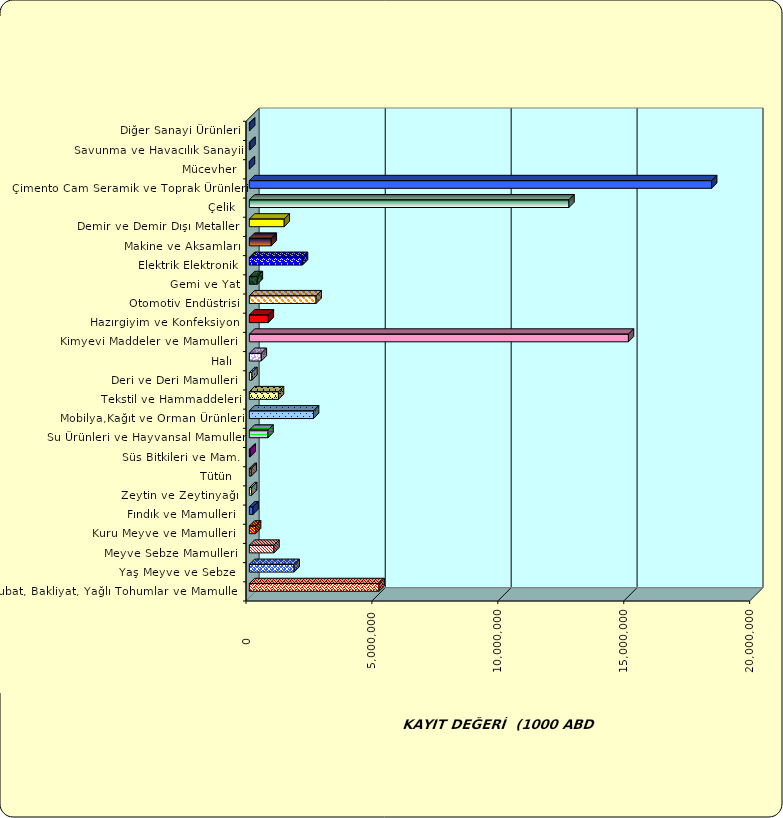
| Category | Series 0 |
|---|---|
|  Hububat, Bakliyat, Yağlı Tohumlar ve Mamulleri  | 5150457.895 |
|  Yaş Meyve ve Sebze   | 1777672.764 |
|  Meyve Sebze Mamulleri  | 976620.416 |
|  Kuru Meyve ve Mamulleri   | 245520.863 |
|  Fındık ve Mamulleri  | 144812.634 |
|  Zeytin ve Zeytinyağı  | 88911.634 |
|  Tütün  | 74180.251 |
|  Süs Bitkileri ve Mam. | 32521.128 |
|  Su Ürünleri ve Hayvansal Mamuller | 739978.662 |
|  Mobilya,Kağıt ve Orman Ürünleri | 2547974.728 |
|  Tekstil ve Hammaddeleri | 1156050.407 |
|  Deri ve Deri Mamulleri  | 100705.902 |
|  Halı  | 474819.432 |
|  Kimyevi Maddeler ve Mamulleri   | 15053352.24 |
|  Hazırgiyim ve Konfeksiyon  | 753413.293 |
|  Otomotiv Endüstrisi | 2650564.967 |
|  Gemi ve Yat | 316551.636 |
|  Elektrik Elektronik | 2108773.149 |
|  Makine ve Aksamları | 869616.274 |
|  Demir ve Demir Dışı Metaller  | 1384444.6 |
|  Çelik | 12691083.108 |
|  Çimento Cam Seramik ve Toprak Ürünleri | 18354907.566 |
|  Mücevher | 3577.516 |
|  Savunma ve Havacılık Sanayii | 23631.99 |
|  Diğer Sanayi Ürünleri | 10960.482 |